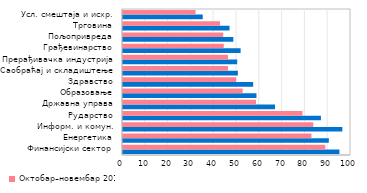
| Category | Октобар–новембар 2019. | Октобар–новембар 2018. |
|---|---|---|
| Финансијски сектор | 94.929 | 88.736 |
| Енергетика | 90.281 | 82.637 |
| Информ. и комун. | 96.215 | 83.456 |
| Рударство | 86.8 | 78.708 |
| Државна управа | 66.655 | 58.355 |
| Образовање | 58.54 | 52.473 |
| Здравство | 57.085 | 49.6 |
| Саобраћај и складиштење | 50.379 | 46.069 |
| Прерађивачка индустрија | 50.083 | 46.088 |
| Грађевинарство | 51.585 | 44.194 |
| Пољопривреда | 48.391 | 43.967 |
| Трговина | 46.722 | 42.569 |
| Усл. смештаја и исхр. | 34.973 | 31.82 |